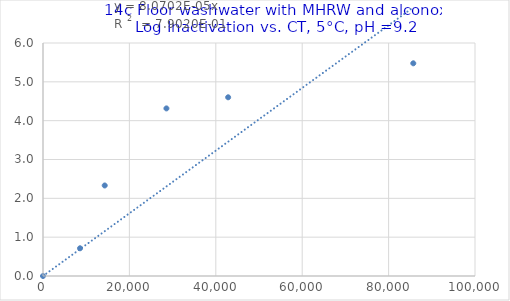
| Category | Series 0 |
|---|---|
| 0.0 | 0 |
| 8571.428571428572 | 0.714 |
| 14285.714285714286 | 2.331 |
| 28571.428571428572 | 4.316 |
| 42857.14285714286 | 4.602 |
| 85714.28571428572 | 5.477 |